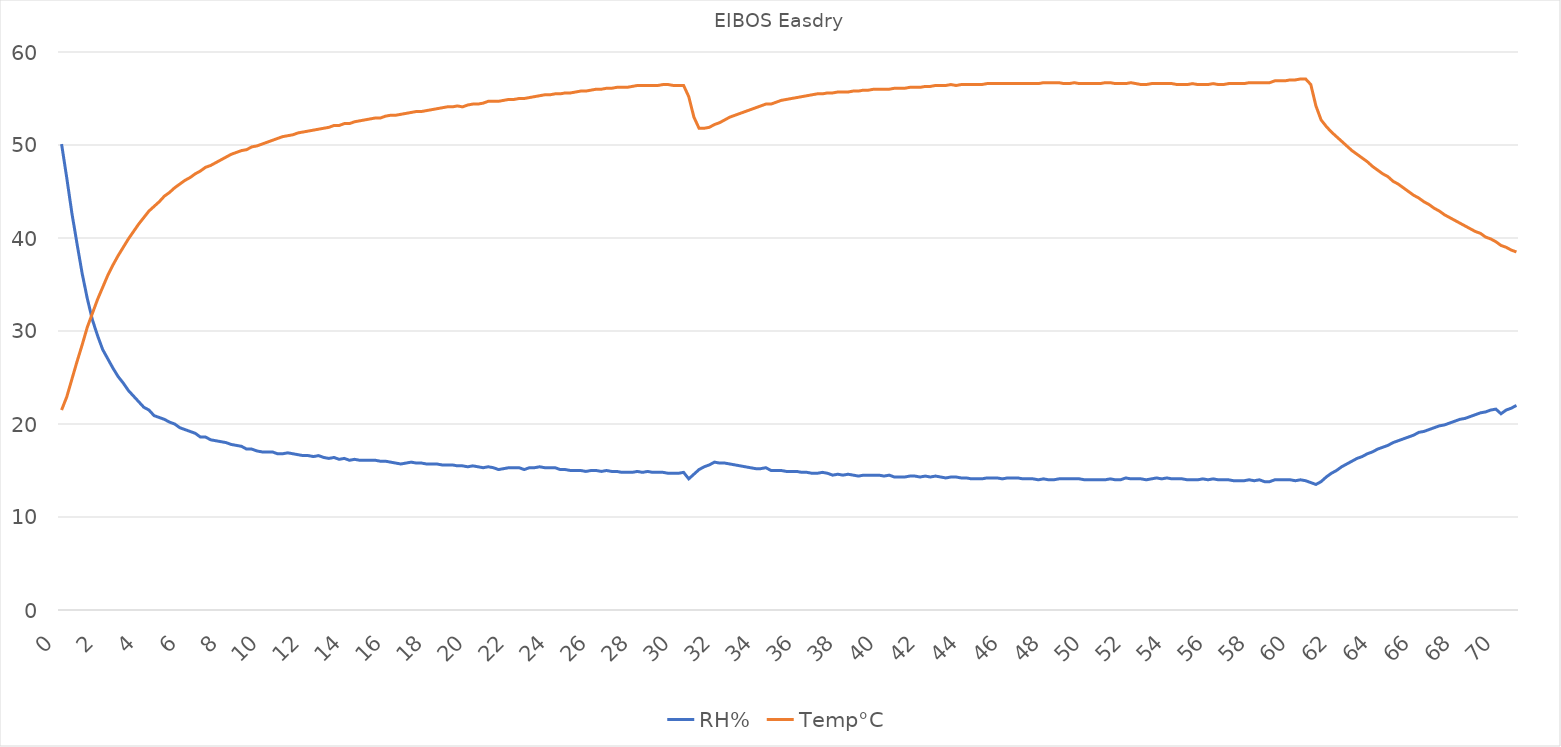
| Category | RH% | Temp°C |
|---|---|---|
| 0.0 | 50.1 | 21.5 |
| 0.25 | 46.5 | 22.9 |
| 0.5 | 42.7 | 24.8 |
| 0.75 | 39.4 | 26.7 |
| 1.0 | 36.2 | 28.5 |
| 1.25 | 33.5 | 30.4 |
| 1.5 | 31.2 | 31.9 |
| 1.75 | 29.5 | 33.4 |
| 2.0 | 28 | 34.7 |
| 2.25 | 27 | 36 |
| 2.5 | 26 | 37.1 |
| 2.75 | 25.1 | 38.1 |
| 3.0 | 24.4 | 39 |
| 3.25 | 23.6 | 39.9 |
| 3.5 | 23 | 40.7 |
| 3.75 | 22.4 | 41.5 |
| 4.0 | 21.8 | 42.2 |
| 4.25 | 21.5 | 42.9 |
| 4.5 | 20.9 | 43.4 |
| 4.75 | 20.7 | 43.9 |
| 5.0 | 20.5 | 44.5 |
| 5.25 | 20.2 | 44.9 |
| 5.5 | 20 | 45.4 |
| 5.75 | 19.6 | 45.8 |
| 6.0 | 19.4 | 46.2 |
| 6.25 | 19.2 | 46.5 |
| 6.5 | 19 | 46.9 |
| 6.75 | 18.6 | 47.2 |
| 7.0 | 18.6 | 47.6 |
| 7.25 | 18.3 | 47.8 |
| 7.5 | 18.2 | 48.1 |
| 7.75 | 18.1 | 48.4 |
| 8.0 | 18 | 48.7 |
| 8.25 | 17.8 | 49 |
| 8.5 | 17.7 | 49.2 |
| 8.75 | 17.6 | 49.4 |
| 9.0 | 17.3 | 49.5 |
| 9.25 | 17.3 | 49.8 |
| 9.5 | 17.1 | 49.9 |
| 9.75 | 17 | 50.1 |
| 10.0 | 17 | 50.3 |
| 10.25 | 17 | 50.5 |
| 10.5 | 16.8 | 50.7 |
| 10.75 | 16.8 | 50.9 |
| 11.0 | 16.9 | 51 |
| 11.25 | 16.8 | 51.1 |
| 11.5 | 16.7 | 51.3 |
| 11.75 | 16.6 | 51.4 |
| 12.0 | 16.6 | 51.5 |
| 12.25 | 16.5 | 51.6 |
| 12.5 | 16.6 | 51.7 |
| 12.75 | 16.4 | 51.8 |
| 13.0 | 16.3 | 51.9 |
| 13.25 | 16.4 | 52.1 |
| 13.5 | 16.2 | 52.1 |
| 13.75 | 16.3 | 52.3 |
| 14.0 | 16.1 | 52.3 |
| 14.25 | 16.2 | 52.5 |
| 14.5 | 16.1 | 52.6 |
| 14.75 | 16.1 | 52.7 |
| 15.0 | 16.1 | 52.8 |
| 15.25 | 16.1 | 52.9 |
| 15.5 | 16 | 52.9 |
| 15.75 | 16 | 53.1 |
| 16.0 | 15.9 | 53.2 |
| 16.25 | 15.8 | 53.2 |
| 16.5 | 15.7 | 53.3 |
| 16.75 | 15.8 | 53.4 |
| 17.0 | 15.9 | 53.5 |
| 17.25 | 15.8 | 53.6 |
| 17.5 | 15.8 | 53.6 |
| 17.75 | 15.7 | 53.7 |
| 18.0 | 15.7 | 53.8 |
| 18.25 | 15.7 | 53.9 |
| 18.5 | 15.6 | 54 |
| 18.75 | 15.6 | 54.1 |
| 19.0 | 15.6 | 54.1 |
| 19.25 | 15.5 | 54.2 |
| 19.5 | 15.5 | 54.1 |
| 19.75 | 15.4 | 54.3 |
| 20.0 | 15.5 | 54.4 |
| 20.25 | 15.4 | 54.4 |
| 20.5 | 15.3 | 54.5 |
| 20.75 | 15.4 | 54.7 |
| 21.0 | 15.3 | 54.7 |
| 21.25 | 15.1 | 54.7 |
| 21.5 | 15.2 | 54.8 |
| 21.75 | 15.3 | 54.9 |
| 22.0 | 15.3 | 54.9 |
| 22.25 | 15.3 | 55 |
| 22.5 | 15.1 | 55 |
| 22.75 | 15.3 | 55.1 |
| 23.0 | 15.3 | 55.2 |
| 23.25 | 15.4 | 55.3 |
| 23.5 | 15.3 | 55.4 |
| 23.75 | 15.3 | 55.4 |
| 24.0 | 15.3 | 55.5 |
| 24.25 | 15.1 | 55.5 |
| 24.5 | 15.1 | 55.6 |
| 24.75 | 15 | 55.6 |
| 25.0 | 15 | 55.7 |
| 25.25 | 15 | 55.8 |
| 25.5 | 14.9 | 55.8 |
| 25.75 | 15 | 55.9 |
| 26.0 | 15 | 56 |
| 26.25 | 14.9 | 56 |
| 26.5 | 15 | 56.1 |
| 26.75 | 14.9 | 56.1 |
| 27.0 | 14.9 | 56.2 |
| 27.25 | 14.8 | 56.2 |
| 27.5 | 14.8 | 56.2 |
| 27.75 | 14.8 | 56.3 |
| 28.0 | 14.9 | 56.4 |
| 28.25 | 14.8 | 56.4 |
| 28.5 | 14.9 | 56.4 |
| 28.75 | 14.8 | 56.4 |
| 29.0 | 14.8 | 56.4 |
| 29.25 | 14.8 | 56.5 |
| 29.5 | 14.7 | 56.5 |
| 29.75 | 14.7 | 56.4 |
| 30.0 | 14.7 | 56.4 |
| 30.25 | 14.8 | 56.4 |
| 30.5 | 14.1 | 55.2 |
| 30.75 | 14.6 | 53 |
| 31.0 | 15.1 | 51.8 |
| 31.25 | 15.4 | 51.8 |
| 31.5 | 15.6 | 51.9 |
| 31.75 | 15.9 | 52.2 |
| 32.0 | 15.8 | 52.4 |
| 32.25 | 15.8 | 52.7 |
| 32.5 | 15.7 | 53 |
| 32.75 | 15.6 | 53.2 |
| 33.0 | 15.5 | 53.4 |
| 33.25 | 15.4 | 53.6 |
| 33.5 | 15.3 | 53.8 |
| 33.75 | 15.2 | 54 |
| 34.0 | 15.2 | 54.2 |
| 34.25 | 15.3 | 54.4 |
| 34.5 | 15 | 54.4 |
| 34.75 | 15 | 54.6 |
| 35.0 | 15 | 54.8 |
| 35.25 | 14.9 | 54.9 |
| 35.5 | 14.9 | 55 |
| 35.75 | 14.9 | 55.1 |
| 36.0 | 14.8 | 55.2 |
| 36.25 | 14.8 | 55.3 |
| 36.5 | 14.7 | 55.4 |
| 36.75 | 14.7 | 55.5 |
| 37.0 | 14.8 | 55.5 |
| 37.25 | 14.7 | 55.6 |
| 37.5 | 14.5 | 55.6 |
| 37.75 | 14.6 | 55.7 |
| 38.0 | 14.5 | 55.7 |
| 38.25 | 14.6 | 55.7 |
| 38.5 | 14.5 | 55.8 |
| 38.75 | 14.4 | 55.8 |
| 39.0 | 14.5 | 55.9 |
| 39.25 | 14.5 | 55.9 |
| 39.5 | 14.5 | 56 |
| 39.75 | 14.5 | 56 |
| 40.0 | 14.4 | 56 |
| 40.25 | 14.5 | 56 |
| 40.5 | 14.3 | 56.1 |
| 40.75 | 14.3 | 56.1 |
| 41.0 | 14.3 | 56.1 |
| 41.25 | 14.4 | 56.2 |
| 41.5 | 14.4 | 56.2 |
| 41.75 | 14.3 | 56.2 |
| 42.0 | 14.4 | 56.3 |
| 42.25 | 14.3 | 56.3 |
| 42.5 | 14.4 | 56.4 |
| 42.75 | 14.3 | 56.4 |
| 43.0 | 14.2 | 56.4 |
| 43.25 | 14.3 | 56.5 |
| 43.5 | 14.3 | 56.4 |
| 43.75 | 14.2 | 56.5 |
| 44.0 | 14.2 | 56.5 |
| 44.25 | 14.1 | 56.5 |
| 44.5 | 14.1 | 56.5 |
| 44.75 | 14.1 | 56.5 |
| 45.0 | 14.2 | 56.6 |
| 45.25 | 14.2 | 56.6 |
| 45.5 | 14.2 | 56.6 |
| 45.75 | 14.1 | 56.6 |
| 46.0 | 14.2 | 56.6 |
| 46.25 | 14.2 | 56.6 |
| 46.5 | 14.2 | 56.6 |
| 46.75 | 14.1 | 56.6 |
| 47.0 | 14.1 | 56.6 |
| 47.25 | 14.1 | 56.6 |
| 47.5 | 14 | 56.6 |
| 47.75 | 14.1 | 56.7 |
| 48.0 | 14 | 56.7 |
| 48.25 | 14 | 56.7 |
| 48.5 | 14.1 | 56.7 |
| 48.75 | 14.1 | 56.6 |
| 49.0 | 14.1 | 56.6 |
| 49.25 | 14.1 | 56.7 |
| 49.5 | 14.1 | 56.6 |
| 49.75 | 14 | 56.6 |
| 50.0 | 14 | 56.6 |
| 50.25 | 14 | 56.6 |
| 50.5 | 14 | 56.6 |
| 50.75 | 14 | 56.7 |
| 51.0 | 14.1 | 56.7 |
| 51.25 | 14 | 56.6 |
| 51.5 | 14 | 56.6 |
| 51.75 | 14.2 | 56.6 |
| 52.0 | 14.1 | 56.7 |
| 52.25 | 14.1 | 56.6 |
| 52.5 | 14.1 | 56.5 |
| 52.75 | 14 | 56.5 |
| 53.0 | 14.1 | 56.6 |
| 53.25 | 14.2 | 56.6 |
| 53.5 | 14.1 | 56.6 |
| 53.75 | 14.2 | 56.6 |
| 54.0 | 14.1 | 56.6 |
| 54.25 | 14.1 | 56.5 |
| 54.5 | 14.1 | 56.5 |
| 54.75 | 14 | 56.5 |
| 55.0 | 14 | 56.6 |
| 55.25 | 14 | 56.5 |
| 55.5 | 14.1 | 56.5 |
| 55.75 | 14 | 56.5 |
| 56.0 | 14.1 | 56.6 |
| 56.25 | 14 | 56.5 |
| 56.5 | 14 | 56.5 |
| 56.75 | 14 | 56.6 |
| 57.0 | 13.9 | 56.6 |
| 57.25 | 13.9 | 56.6 |
| 57.5 | 13.9 | 56.6 |
| 57.75 | 14 | 56.7 |
| 58.0 | 13.9 | 56.7 |
| 58.25 | 14 | 56.7 |
| 58.5 | 13.8 | 56.7 |
| 58.75 | 13.8 | 56.7 |
| 59.0 | 14 | 56.9 |
| 59.25 | 14 | 56.9 |
| 59.5 | 14 | 56.9 |
| 59.75 | 14 | 57 |
| 60.0 | 13.9 | 57 |
| 60.25 | 14 | 57.1 |
| 60.5 | 13.9 | 57.1 |
| 60.75 | 13.7 | 56.5 |
| 61.0 | 13.5 | 54.2 |
| 61.25 | 13.8 | 52.7 |
| 61.5 | 14.3 | 52 |
| 61.75 | 14.7 | 51.4 |
| 62.0 | 15 | 50.9 |
| 62.25 | 15.4 | 50.4 |
| 62.5 | 15.7 | 49.9 |
| 62.75 | 16 | 49.4 |
| 63.0 | 16.3 | 49 |
| 63.25 | 16.5 | 48.6 |
| 63.5 | 16.8 | 48.2 |
| 63.75 | 17 | 47.7 |
| 64.0 | 17.3 | 47.3 |
| 64.25 | 17.5 | 46.9 |
| 64.5 | 17.7 | 46.6 |
| 64.75 | 18 | 46.1 |
| 65.0 | 18.2 | 45.8 |
| 65.25 | 18.4 | 45.4 |
| 65.5 | 18.6 | 45 |
| 65.75 | 18.8 | 44.6 |
| 66.0 | 19.1 | 44.3 |
| 66.25 | 19.2 | 43.9 |
| 66.5 | 19.4 | 43.6 |
| 66.75 | 19.6 | 43.2 |
| 67.0 | 19.8 | 42.9 |
| 67.25 | 19.9 | 42.5 |
| 67.5 | 20.1 | 42.2 |
| 67.75 | 20.3 | 41.9 |
| 68.0 | 20.5 | 41.6 |
| 68.25 | 20.6 | 41.3 |
| 68.5 | 20.8 | 41 |
| 68.75 | 21 | 40.7 |
| 69.0 | 21.2 | 40.5 |
| 69.25 | 21.3 | 40.1 |
| 69.5 | 21.5 | 39.9 |
| 69.75 | 21.6 | 39.6 |
| 70.0 | 21.1 | 39.2 |
| 70.25 | 21.5 | 39 |
| 70.5 | 21.7 | 38.7 |
| 70.75 | 22 | 38.5 |